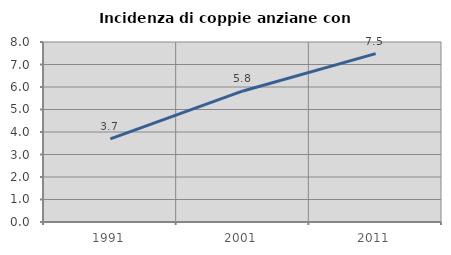
| Category | Incidenza di coppie anziane con figli |
|---|---|
| 1991.0 | 3.691 |
| 2001.0 | 5.825 |
| 2011.0 | 7.483 |